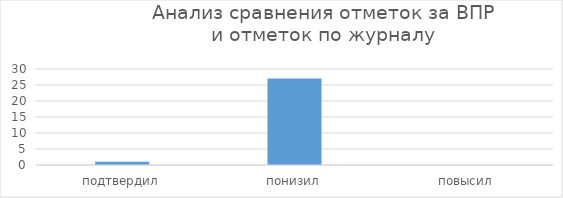
| Category | Series 0 |
|---|---|
| подтвердил | 1 |
| понизил | 27 |
| повысил | 0 |